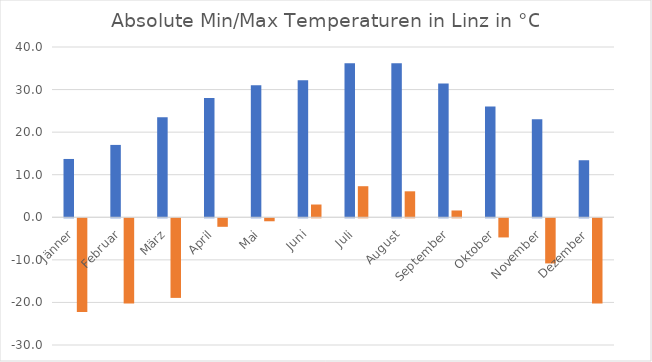
| Category | Min | Max |
|---|---|---|
| Jänner | 13.7 | -22 |
| Februar | 17 | -20 |
| März | 23.5 | -18.7 |
| April | 28 | -2 |
| Mai | 31 | -0.7 |
| Juni | 32.2 | 3 |
| Juli | 36.2 | 7.3 |
| August | 36.2 | 6.1 |
| September | 31.4 | 1.6 |
| Oktober | 26 | -4.5 |
| November | 23 | -10.6 |
| Dezember | 13.4 | -20 |